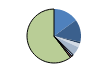
| Category | Series 0 |
|---|---|
| ARRASTRE | 175 |
| CERCO | 156 |
| ATUNEROS CAÑEROS | 13 |
| PALANGRE DE FONDO | 27 |
| PALANGRE DE SUPERFICIE | 59 |
| RASCO | 5 |
| VOLANTA | 14 |
| ARTES FIJAS | 12 |
| ARTES MENORES | 703 |